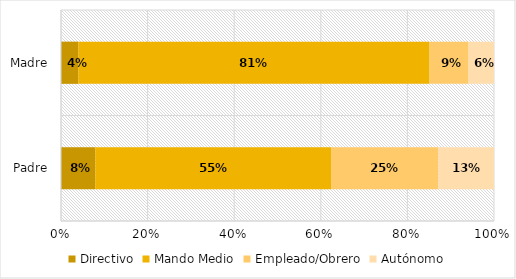
| Category | Directivo | Mando Medio | Empleado/Obrero | Autónomo |
|---|---|---|---|---|
| Padre | 0.08 | 0.55 | 0.25 | 0.13 |
| Madre | 0.04 | 0.81 | 0.09 | 0.06 |